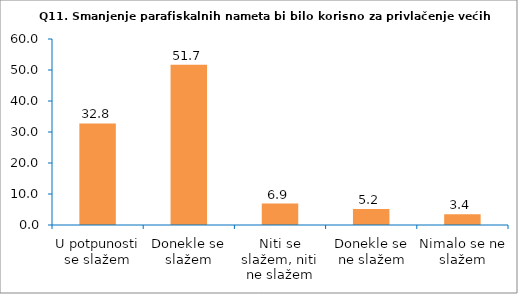
| Category | Series 0 |
|---|---|
| U potpunosti se slažem | 32.759 |
| Donekle se slažem | 51.724 |
| Niti se slažem, niti ne slažem | 6.897 |
| Donekle se ne slažem | 5.172 |
| Nimalo se ne slažem | 3.448 |